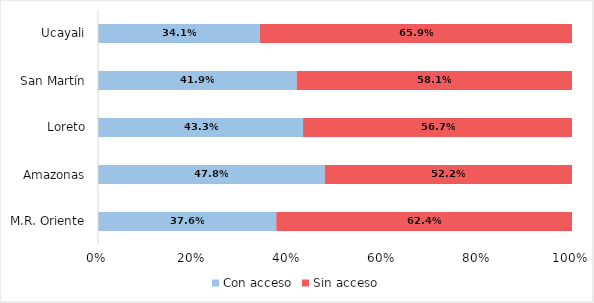
| Category | Con acceso | Sin acceso |
|---|---|---|
| M.R. Oriente | 606568.39 | 1006273.31 |
| Amazonas | 111456.1 | 121549.8 |
| Loreto | 209926.9 | 275333.8 |
| San Martín | 194573.9 | 269599.5 |
| Ucayali | 90611.49 | 174962.21 |